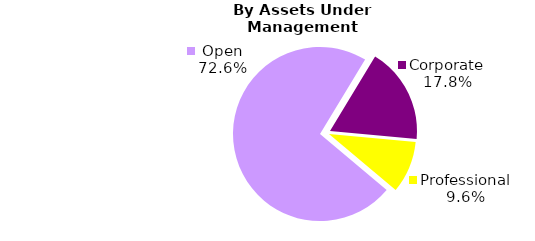
| Category | Series 0 |
|---|---|
| Open | 882.768 |
| Corporate | 216.417 |
| Professional | 117.366 |